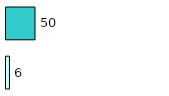
| Category | Series 0 | Series 1 |
|---|---|---|
| 0 | 6 | 50 |